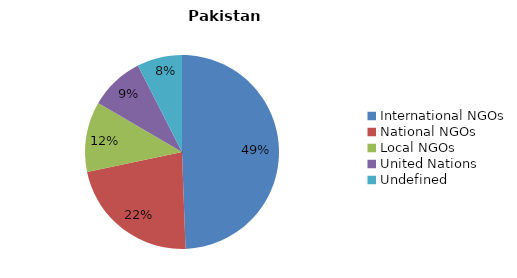
| Category | Series 0 |
|---|---|
| International NGOs | 0.494 |
| National NGOs | 0.223 |
| Local NGOs | 0.117 |
| United Nations | 0.091 |
| Undefined | 0.075 |